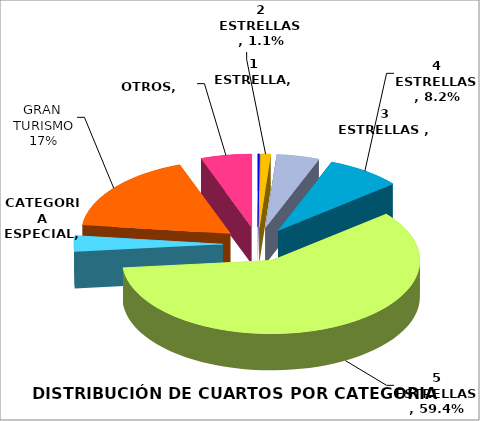
| Category | CATEGORIA  |
|---|---|
| 1 ESTRELLA | 0.002 |
| 2 ESTRELLAS | 0.011 |
| 3 ESTRELLAS  | 0.046 |
| 4 ESTRELLAS | 0.082 |
| 5 ESTRELLAS | 0.594 |
| CATEGORIA ESPECIAL | 0.035 |
| GRAN TURISMO | 0.176 |
| OTROS | 0.055 |